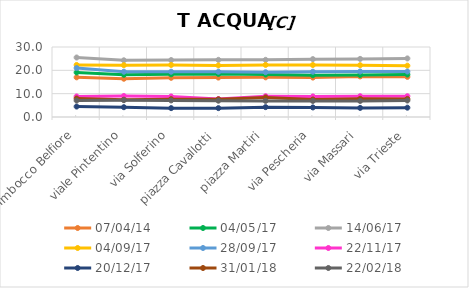
| Category | 07/04/14 | 04/05/17 | 14/06/17 | 04/09/17 | 28/09/17 | 22/11/17 | 20/12/17 | 31/01/18 | 22/02/18 |
|---|---|---|---|---|---|---|---|---|---|
| Imbocco Belfiore | 17 | 19.1 | 25.5 | 22.3 | 21 | 8.8 | 4.48 | 7.94 | 7.06 |
| viale Pintentino | 16.4 | 18.1 | 24.3 | 22.2 | 19.4 | 9 | 4.2 | 7.4 | 7.22 |
| via Solferino | 16.8 | 18.3 | 24.4 | 22.3 | 19.4 | 8.8 | 3.8 | 7.65 | 7.11 |
| piazza Cavallotti | 16.9 | 18.48 | 24.5 | 22.1 | 19.4 | 7.7 | 3.8 | 7.59 | 6.99 |
| piazza Martiri | 17 | 18.2 | 24.5 | 22.33 | 19.2 | 8.9 | 4.23 | 8.41 | 6.91 |
| via Pescheria | 16.9 | 17.9 | 24.8 | 22.28 | 19.4 | 8.8 | 4.1 | 7.51 | 6.88 |
| via Massari | 17.4 | 18 | 24.9 | 22.2 | 19.5 | 8.9 | 3.9 | 7.8 | 6.87 |
| via Trieste | 17.2 | 18.2 | 25.1 | 22 | 19.5 | 8.9 | 4 | 7.75 | 7.07 |